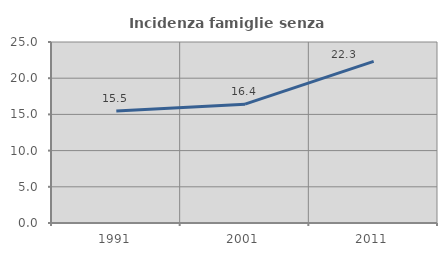
| Category | Incidenza famiglie senza nuclei |
|---|---|
| 1991.0 | 15.473 |
| 2001.0 | 16.417 |
| 2011.0 | 22.321 |